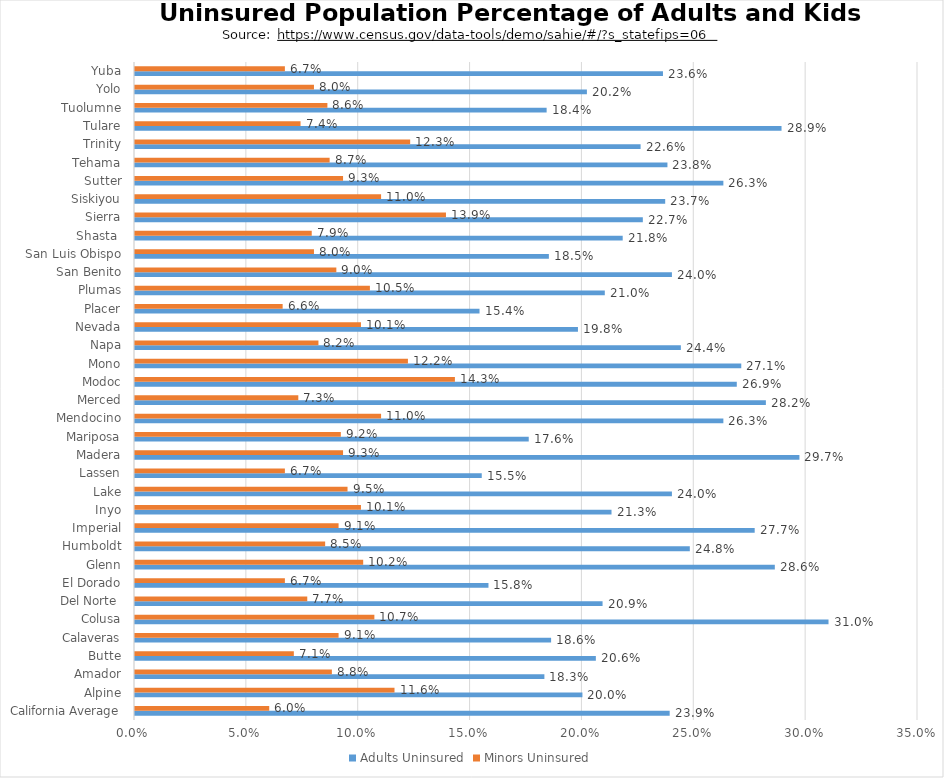
| Category | Adults Uninsured | Minors Uninsured |
|---|---|---|
| California Average | 0.239 | 0.06 |
| Alpine | 0.2 | 0.116 |
| Amador | 0.183 | 0.088 |
| Butte | 0.206 | 0.071 |
| Calaveras | 0.186 | 0.091 |
| Colusa | 0.31 | 0.107 |
| Del Norte  | 0.209 | 0.077 |
| El Dorado | 0.158 | 0.067 |
| Glenn | 0.286 | 0.102 |
| Humboldt | 0.248 | 0.085 |
| Imperial | 0.277 | 0.091 |
| Inyo | 0.213 | 0.101 |
| Lake | 0.24 | 0.095 |
| Lassen | 0.155 | 0.067 |
| Madera | 0.297 | 0.093 |
| Mariposa | 0.176 | 0.092 |
| Mendocino | 0.263 | 0.11 |
| Merced | 0.282 | 0.073 |
| Modoc | 0.269 | 0.143 |
| Mono | 0.271 | 0.122 |
| Napa | 0.244 | 0.082 |
| Nevada | 0.198 | 0.101 |
| Placer | 0.154 | 0.066 |
| Plumas | 0.21 | 0.105 |
| San Benito | 0.24 | 0.09 |
| San Luis Obispo | 0.185 | 0.08 |
| Shasta  | 0.218 | 0.079 |
| Sierra | 0.227 | 0.139 |
| Siskiyou | 0.237 | 0.11 |
| Sutter | 0.263 | 0.093 |
| Tehama | 0.238 | 0.087 |
| Trinity | 0.226 | 0.123 |
| Tulare | 0.289 | 0.074 |
| Tuolumne | 0.184 | 0.086 |
| Yolo | 0.202 | 0.08 |
| Yuba | 0.236 | 0.067 |